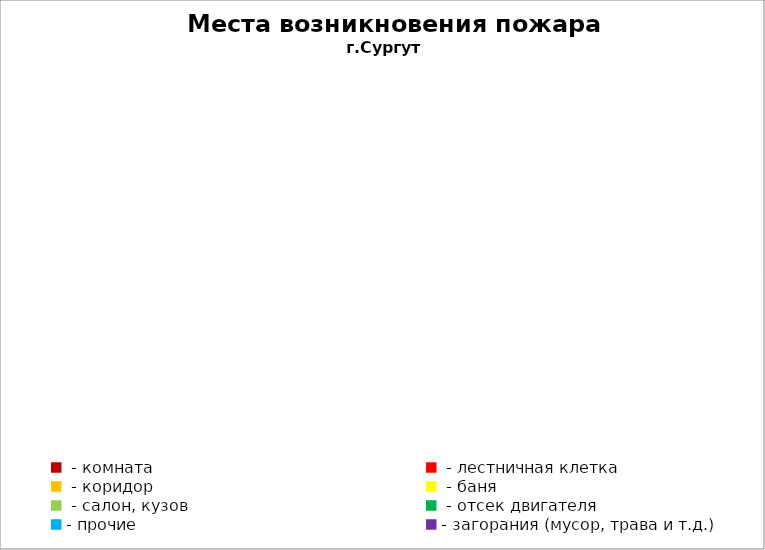
| Category | Места возникновения пожара |
|---|---|
|  - комната | 40 |
|  - лестничная клетка | 10 |
|  - коридор | 5 |
|  - баня | 12 |
|  - салон, кузов | 4 |
|  - отсек двигателя | 10 |
| - прочие | 50 |
| - загорания (мусор, трава и т.д.)  | 80 |